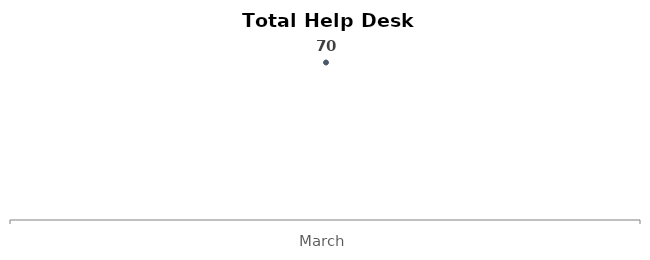
| Category | Total |
|---|---|
| March | 70 |